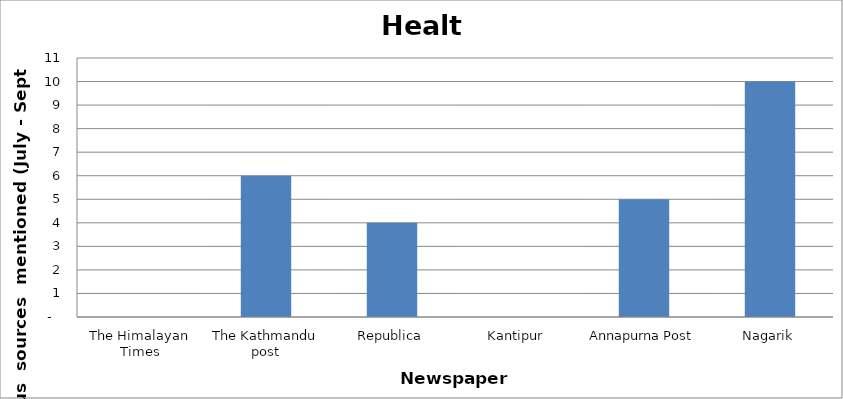
| Category | Health |
|---|---|
| The Himalayan Times | 0 |
| The Kathmandu post | 6 |
| Republica | 4 |
| Kantipur | 0 |
| Annapurna Post | 5 |
| Nagarik | 10 |